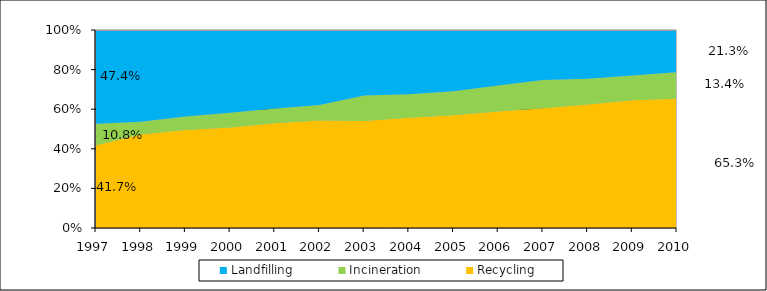
| Category | Recycling | Incineration | Landfilling |
|---|---|---|---|
| 1997.0 | 0.417 | 0.108 | 0.474 |
| 1998.0 | 0.473 | 0.064 | 0.463 |
| 1999.0 | 0.495 | 0.068 | 0.437 |
| 2000.0 | 0.508 | 0.074 | 0.418 |
| 2001.0 | 0.529 | 0.075 | 0.397 |
| 2002.0 | 0.543 | 0.078 | 0.379 |
| 2003.0 | 0.541 | 0.128 | 0.331 |
| 2004.0 | 0.556 | 0.119 | 0.325 |
| 2005.0 | 0.57 | 0.121 | 0.309 |
| 2006.0 | 0.589 | 0.13 | 0.281 |
| 2007.0 | 0.605 | 0.143 | 0.252 |
| 2008.0 | 0.623 | 0.13 | 0.247 |
| 2009.0 | 0.645 | 0.125 | 0.229 |
| 2010.0 | 0.653 | 0.134 | 0.213 |